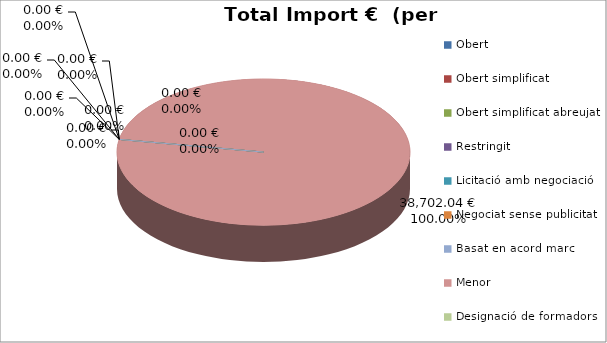
| Category | Total preu              (amb iva) |
|---|---|
| Obert | 0 |
| Obert simplificat | 0 |
| Obert simplificat abreujat | 0 |
| Restringit | 0 |
| Licitació amb negociació | 0 |
| Negociat sense publicitat | 0 |
| Basat en acord marc | 0 |
| Menor | 38702.04 |
| Designació de formadors | 0 |